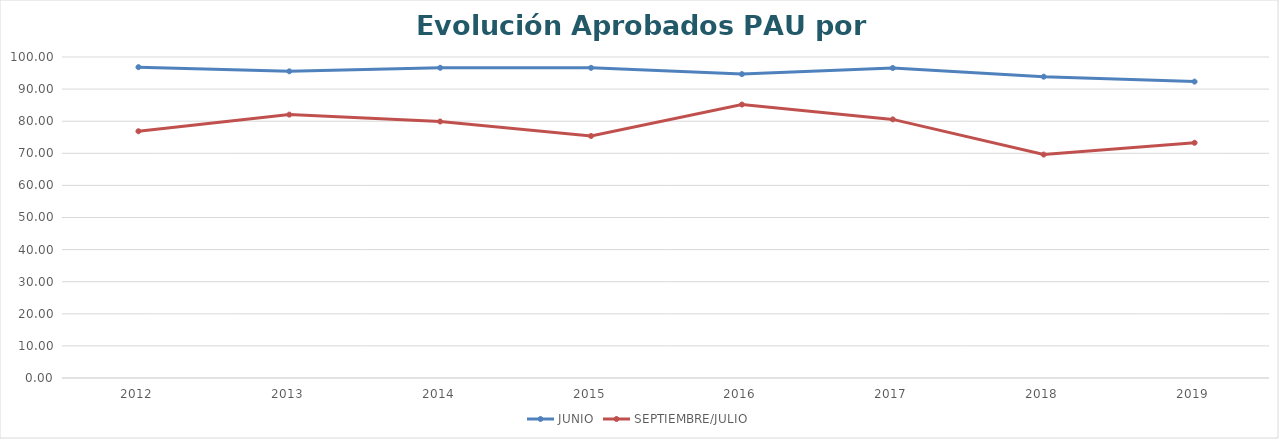
| Category | JUNIO | SEPTIEMBRE/JULIO |
|---|---|---|
| 2012.0 | 96.835 | 76.871 |
| 2013.0 | 95.54 | 82.051 |
| 2014.0 | 96.642 | 79.903 |
| 2015.0 | 96.623 | 75.393 |
| 2016.0 | 94.672 | 85.185 |
| 2017.0 | 96.573 | 80.564 |
| 2018.0 | 93.872 | 69.61 |
| 2019.0 | 92.33 | 73.28 |